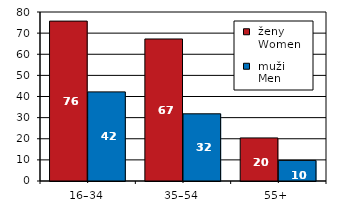
| Category |  ženy 
 Women |  muži 
 Men |
|---|---|---|
| 16–34 | 75.69 | 42.183 |
| 35–54 | 67.228 | 31.808 |
| 55+  | 20.391 | 9.747 |